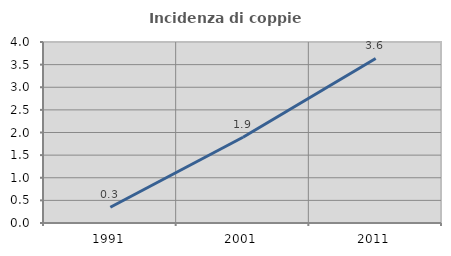
| Category | Incidenza di coppie miste |
|---|---|
| 1991.0 | 0.349 |
| 2001.0 | 1.894 |
| 2011.0 | 3.636 |